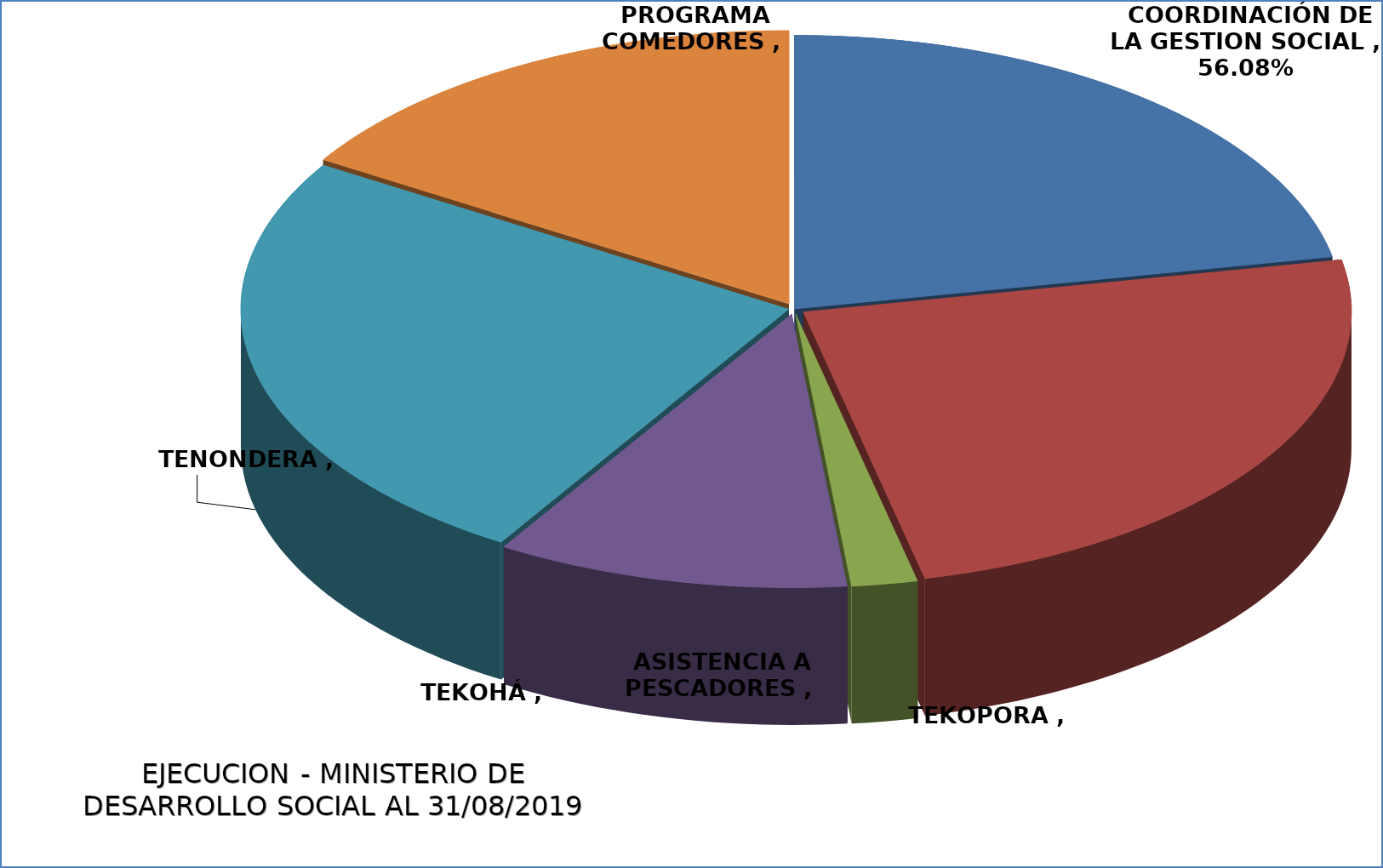
| Category |  EJECUCIÓN - MINISTERIO DE DESARROLLO SOCIAL  |
|---|---|
|  COORDINACIÓN DE LA GESTION SOCIAL  | 0.561 |
|  TEKOPORA  | 0.626 |
|  ASISTENCIA A PESCADORES  | 0.05 |
|  TEKOHÁ  | 0.266 |
|  TENONDERA  | 0.64 |
|  PROGRAMA COMEDORES  | 0.413 |